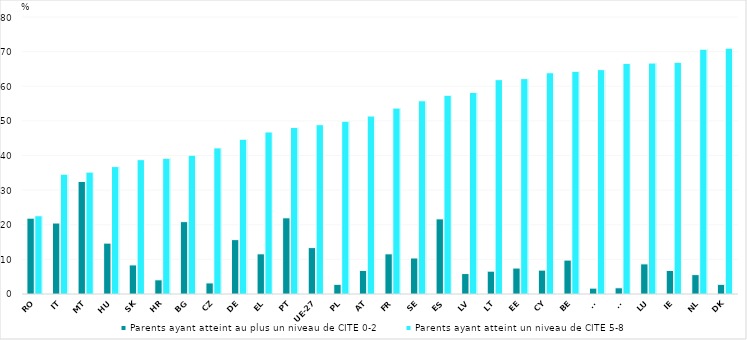
| Category | Parents ayant atteint au plus un niveau de CITE 0-2 | Parents ayant atteint un niveau de CITE 5-8 |
|---|---|---|
| RO | 21.9 | 22.6 |
| IT | 20.5 | 34.6 |
| MT | 32.5 | 35.2 |
| HU | 14.7 | 36.8 |
| SK | 8.4 | 38.8 |
| HR | 4.1 | 39.2 |
| BG | 20.9 | 40.1 |
| CZ | 3.2 | 42.2 |
| DE | 15.7 | 44.7 |
| EL | 11.6 | 46.8 |
| PT | 22 | 48.1 |
| UE-27 | 13.4 | 48.9 |
| PL | 2.8 | 49.9 |
| AT | 6.8 | 51.4 |
| FR | 11.6 | 53.7 |
| SE | 10.4 | 55.8 |
| ES | 21.7 | 57.4 |
| LV | 5.9 | 58.2 |
| LT | 6.6 | 61.9 |
| EE | 7.5 | 62.2 |
| CY | 6.9 | 63.9 |
| BE | 9.8 | 64.3 |
| FI | 1.7 | 64.8 |
| SI | 1.8 | 66.6 |
| LU | 8.7 | 66.7 |
| IE | 6.8 | 66.9 |
| NL | 5.6 | 70.7 |
| DK | 2.8 | 71 |